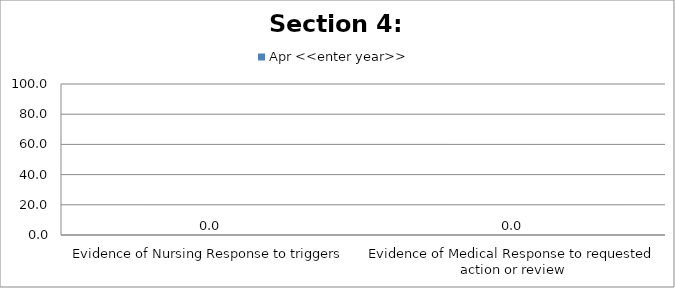
| Category | Apr <<enter year>> |
|---|---|
| Evidence of Nursing Response to triggers | 0 |
| Evidence of Medical Response to requested action or review | 0 |